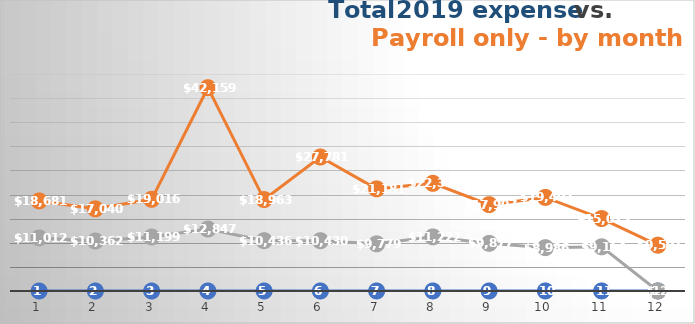
| Category | Series 0 | Series 1 | Series 2 |
|---|---|---|---|
| 0 | 1 | 18681 | 11012 |
| 1 | 2 | 17040 | 10362 |
| 2 | 3 | 19016 | 11199 |
| 3 | 4 | 42159 | 12847 |
| 4 | 5 | 18963 | 10436 |
| 5 | 6 | 27781 | 10430 |
| 6 | 7 | 21181 | 9779 |
| 7 | 8 | 22328 | 11222 |
| 8 | 9 | 17907 | 9877 |
| 9 | 10 | 19407 | 8986 |
| 10 | 11 | 15023 | 9164 |
| 11 | 12 | 9501 | 0 |